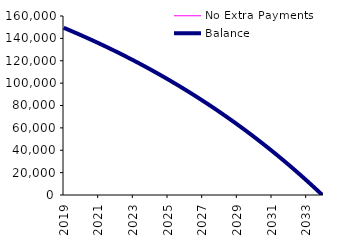
| Category | No Extra Payments | Balance |
|---|---|---|
| 2019-01-01 | 149461.87 | 149461.87 |
| 2019-02-01 | 148921.27 | 148921.27 |
| 2019-03-01 | 148378.2 | 148378.2 |
| 2019-04-01 | 147832.64 | 147832.64 |
| 2019-05-01 | 147284.58 | 147284.58 |
| 2019-06-01 | 146734 | 146734 |
| 2019-07-01 | 146180.9 | 146180.9 |
| 2019-08-01 | 145625.27 | 145625.27 |
| 2019-09-01 | 145067.09 | 145067.09 |
| 2019-10-01 | 144506.35 | 144506.35 |
| 2019-11-01 | 143943.04 | 143943.04 |
| 2019-12-01 | 143377.15 | 143377.15 |
| 2020-01-01 | 142808.67 | 142808.67 |
| 2020-02-01 | 142237.58 | 142237.58 |
| 2020-03-01 | 141663.87 | 141663.87 |
| 2020-04-01 | 141087.53 | 141087.53 |
| 2020-05-01 | 140508.55 | 140508.55 |
| 2020-06-01 | 139926.92 | 139926.92 |
| 2020-07-01 | 139342.62 | 139342.62 |
| 2020-08-01 | 138755.64 | 138755.64 |
| 2020-09-01 | 138165.97 | 138165.97 |
| 2020-10-01 | 137573.6 | 137573.6 |
| 2020-11-01 | 136978.52 | 136978.52 |
| 2020-12-01 | 136380.71 | 136380.71 |
| 2021-01-01 | 135780.16 | 135780.16 |
| 2021-02-01 | 135176.86 | 135176.86 |
| 2021-03-01 | 134570.79 | 134570.79 |
| 2021-04-01 | 133961.94 | 133961.94 |
| 2021-05-01 | 133350.3 | 133350.3 |
| 2021-06-01 | 132735.86 | 132735.86 |
| 2021-07-01 | 132118.6 | 132118.6 |
| 2021-08-01 | 131498.51 | 131498.51 |
| 2021-09-01 | 130875.58 | 130875.58 |
| 2021-10-01 | 130249.8 | 130249.8 |
| 2021-11-01 | 129621.15 | 129621.15 |
| 2021-12-01 | 128989.62 | 128989.62 |
| 2022-01-01 | 128355.19 | 128355.19 |
| 2022-02-01 | 127717.85 | 127717.85 |
| 2022-03-01 | 127077.59 | 127077.59 |
| 2022-04-01 | 126434.4 | 126434.4 |
| 2022-05-01 | 125788.26 | 125788.26 |
| 2022-06-01 | 125139.16 | 125139.16 |
| 2022-07-01 | 124487.08 | 124487.08 |
| 2022-08-01 | 123832.02 | 123832.02 |
| 2022-09-01 | 123173.95 | 123173.95 |
| 2022-10-01 | 122512.87 | 122512.87 |
| 2022-11-01 | 121848.76 | 121848.76 |
| 2022-12-01 | 121181.6 | 121181.6 |
| 2023-01-01 | 120511.39 | 120511.39 |
| 2023-02-01 | 119838.1 | 119838.1 |
| 2023-03-01 | 119161.73 | 119161.73 |
| 2023-04-01 | 118482.26 | 118482.26 |
| 2023-05-01 | 117799.67 | 117799.67 |
| 2023-06-01 | 117113.96 | 117113.96 |
| 2023-07-01 | 116425.1 | 116425.1 |
| 2023-08-01 | 115733.09 | 115733.09 |
| 2023-09-01 | 115037.9 | 115037.9 |
| 2023-10-01 | 114339.53 | 114339.53 |
| 2023-11-01 | 113637.96 | 113637.96 |
| 2023-12-01 | 112933.17 | 112933.17 |
| 2024-01-01 | 112225.15 | 112225.15 |
| 2024-02-01 | 111513.89 | 111513.89 |
| 2024-03-01 | 110799.37 | 110799.37 |
| 2024-04-01 | 110081.57 | 110081.57 |
| 2024-05-01 | 109360.48 | 109360.48 |
| 2024-06-01 | 108636.09 | 108636.09 |
| 2024-07-01 | 107908.38 | 107908.38 |
| 2024-08-01 | 107177.33 | 107177.33 |
| 2024-09-01 | 106442.93 | 106442.93 |
| 2024-10-01 | 105705.16 | 105705.16 |
| 2024-11-01 | 104964.01 | 104964.01 |
| 2024-12-01 | 104219.47 | 104219.47 |
| 2025-01-01 | 103471.51 | 103471.51 |
| 2025-02-01 | 102720.12 | 102720.12 |
| 2025-03-01 | 101965.29 | 101965.29 |
| 2025-04-01 | 101207 | 101207 |
| 2025-05-01 | 100445.24 | 100445.24 |
| 2025-06-01 | 99679.98 | 99679.98 |
| 2025-07-01 | 98911.22 | 98911.22 |
| 2025-08-01 | 98138.93 | 98138.93 |
| 2025-09-01 | 97363.1 | 97363.1 |
| 2025-10-01 | 96583.72 | 96583.72 |
| 2025-11-01 | 95800.77 | 95800.77 |
| 2025-12-01 | 95014.23 | 95014.23 |
| 2026-01-01 | 94224.08 | 94224.08 |
| 2026-02-01 | 93430.31 | 93430.31 |
| 2026-03-01 | 92632.9 | 92632.9 |
| 2026-04-01 | 91831.84 | 91831.84 |
| 2026-05-01 | 91027.11 | 91027.11 |
| 2026-06-01 | 90218.69 | 90218.69 |
| 2026-07-01 | 89406.56 | 89406.56 |
| 2026-08-01 | 88590.71 | 88590.71 |
| 2026-09-01 | 87771.12 | 87771.12 |
| 2026-10-01 | 86947.77 | 86947.77 |
| 2026-11-01 | 86120.65 | 86120.65 |
| 2026-12-01 | 85289.74 | 85289.74 |
| 2027-01-01 | 84455.02 | 84455.02 |
| 2027-02-01 | 83616.48 | 83616.48 |
| 2027-03-01 | 82774.09 | 82774.09 |
| 2027-04-01 | 81927.84 | 81927.84 |
| 2027-05-01 | 81077.71 | 81077.71 |
| 2027-06-01 | 80223.69 | 80223.69 |
| 2027-07-01 | 79365.75 | 79365.75 |
| 2027-08-01 | 78503.88 | 78503.88 |
| 2027-09-01 | 77638.06 | 77638.06 |
| 2027-10-01 | 76768.27 | 76768.27 |
| 2027-11-01 | 75894.49 | 75894.49 |
| 2027-12-01 | 75016.71 | 75016.71 |
| 2028-01-01 | 74134.91 | 74134.91 |
| 2028-02-01 | 73249.07 | 73249.07 |
| 2028-03-01 | 72359.16 | 72359.16 |
| 2028-04-01 | 71465.18 | 71465.18 |
| 2028-05-01 | 70567.1 | 70567.1 |
| 2028-06-01 | 69664.9 | 69664.9 |
| 2028-07-01 | 68758.57 | 68758.57 |
| 2028-08-01 | 67848.08 | 67848.08 |
| 2028-09-01 | 66933.42 | 66933.42 |
| 2028-10-01 | 66014.57 | 66014.57 |
| 2028-11-01 | 65091.51 | 65091.51 |
| 2028-12-01 | 64164.22 | 64164.22 |
| 2029-01-01 | 63232.68 | 63232.68 |
| 2029-02-01 | 62296.87 | 62296.87 |
| 2029-03-01 | 61356.77 | 61356.77 |
| 2029-04-01 | 60412.36 | 60412.36 |
| 2029-05-01 | 59463.62 | 59463.62 |
| 2029-06-01 | 58510.53 | 58510.53 |
| 2029-07-01 | 57553.07 | 57553.07 |
| 2029-08-01 | 56591.22 | 56591.22 |
| 2029-09-01 | 55624.97 | 55624.97 |
| 2029-10-01 | 54654.29 | 54654.29 |
| 2029-11-01 | 53679.16 | 53679.16 |
| 2029-12-01 | 52699.56 | 52699.56 |
| 2030-01-01 | 51715.47 | 51715.47 |
| 2030-02-01 | 50726.87 | 50726.87 |
| 2030-03-01 | 49733.74 | 49733.74 |
| 2030-04-01 | 48736.06 | 48736.06 |
| 2030-05-01 | 47733.8 | 47733.8 |
| 2030-06-01 | 46726.95 | 46726.95 |
| 2030-07-01 | 45715.49 | 45715.49 |
| 2030-08-01 | 44699.39 | 44699.39 |
| 2030-09-01 | 43678.63 | 43678.63 |
| 2030-10-01 | 42653.19 | 42653.19 |
| 2030-11-01 | 41623.05 | 41623.05 |
| 2030-12-01 | 40588.19 | 40588.19 |
| 2031-01-01 | 39548.59 | 39548.59 |
| 2031-02-01 | 38504.22 | 38504.22 |
| 2031-03-01 | 37455.07 | 37455.07 |
| 2031-04-01 | 36401.11 | 36401.11 |
| 2031-05-01 | 35342.32 | 35342.32 |
| 2031-06-01 | 34278.68 | 34278.68 |
| 2031-07-01 | 33210.16 | 33210.16 |
| 2031-08-01 | 32136.74 | 32136.74 |
| 2031-09-01 | 31058.4 | 31058.4 |
| 2031-10-01 | 29975.12 | 29975.12 |
| 2031-11-01 | 28886.88 | 28886.88 |
| 2031-12-01 | 27793.65 | 27793.65 |
| 2032-01-01 | 26695.41 | 26695.41 |
| 2032-02-01 | 25592.13 | 25592.13 |
| 2032-03-01 | 24483.8 | 24483.8 |
| 2032-04-01 | 23370.39 | 23370.39 |
| 2032-05-01 | 22251.87 | 22251.87 |
| 2032-06-01 | 21128.23 | 21128.23 |
| 2032-07-01 | 19999.44 | 19999.44 |
| 2032-08-01 | 18865.47 | 18865.47 |
| 2032-09-01 | 17726.31 | 17726.31 |
| 2032-10-01 | 16581.93 | 16581.93 |
| 2032-11-01 | 15432.3 | 15432.3 |
| 2032-12-01 | 14277.4 | 14277.4 |
| 2033-01-01 | 13117.21 | 13117.21 |
| 2033-02-01 | 11951.7 | 11951.7 |
| 2033-03-01 | 10780.85 | 10780.85 |
| 2033-04-01 | 9604.63 | 9604.63 |
| 2033-05-01 | 8423.02 | 8423.02 |
| 2033-06-01 | 7236 | 7236 |
| 2033-07-01 | 6043.54 | 6043.54 |
| 2033-08-01 | 4845.61 | 4845.61 |
| 2033-09-01 | 3642.19 | 3642.19 |
| 2033-10-01 | 2433.25 | 2433.25 |
| 2033-11-01 | 1218.77 | 1218.77 |
| 2033-12-01 | 0 | 0 |